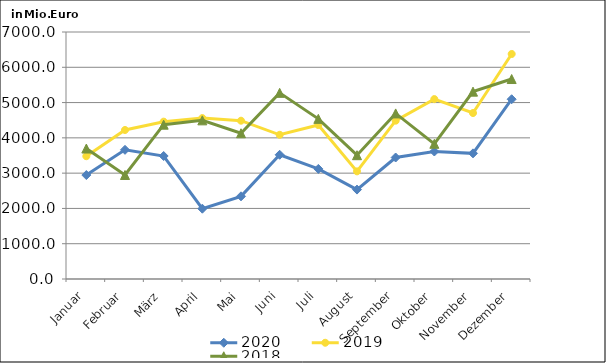
| Category | 2020 | 2019 | 2018 |
|---|---|---|---|
| Januar | 2945.671 | 3480.07 | 3697.342 |
| Februar | 3660.835 | 4222.936 | 2948.215 |
| März | 3485.464 | 4458.832 | 4373.645 |
| April | 1992.485 | 4560.513 | 4496.151 |
| Mai | 2343.097 | 4486.39 | 4130.497 |
| Juni | 3520.65 | 4086.563 | 5275.525 |
| Juli | 3119.659 | 4363.895 | 4538.362 |
| August | 2533.954 | 3050.322 | 3508.574 |
| September | 3442.897 | 4487.113 | 4692.822 |
| Oktober | 3613.32 | 5098.236 | 3831.402 |
| November | 3561.001 | 4703.747 | 5309.883 |
| Dezember | 5094.283 | 6377.077 | 5667.204 |